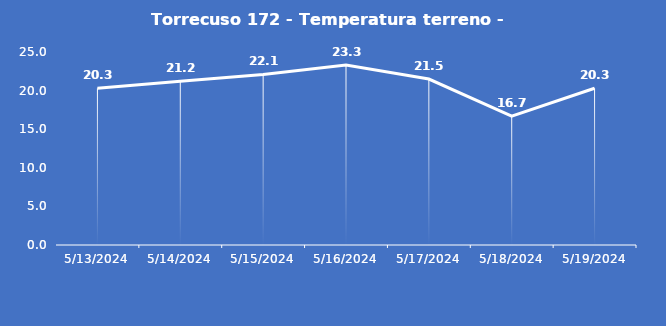
| Category | Torrecuso 172 - Temperatura terreno - Grezzo (°C) |
|---|---|
| 5/13/24 | 20.3 |
| 5/14/24 | 21.2 |
| 5/15/24 | 22.1 |
| 5/16/24 | 23.3 |
| 5/17/24 | 21.5 |
| 5/18/24 | 16.7 |
| 5/19/24 | 20.3 |